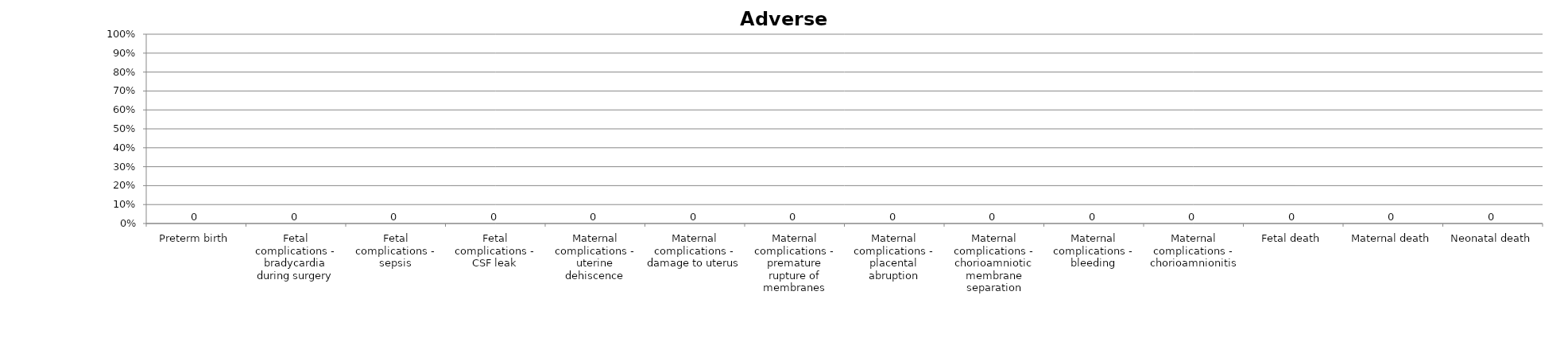
| Category | Series 0 |
|---|---|
| Preterm birth | 0 |
| Fetal complications - bradycardia during surgery | 0 |
| Fetal complications - sepsis | 0 |
| Fetal complications - CSF leak | 0 |
| Maternal complications - uterine dehiscence | 0 |
| Maternal complications - damage to uterus | 0 |
| Maternal complications - premature rupture of membranes | 0 |
| Maternal complications - placental abruption | 0 |
| Maternal complications - chorioamniotic membrane separation | 0 |
| Maternal complications - bleeding | 0 |
| Maternal complications - chorioamnionitis | 0 |
| Fetal death | 0 |
| Maternal death | 0 |
| Neonatal death | 0 |